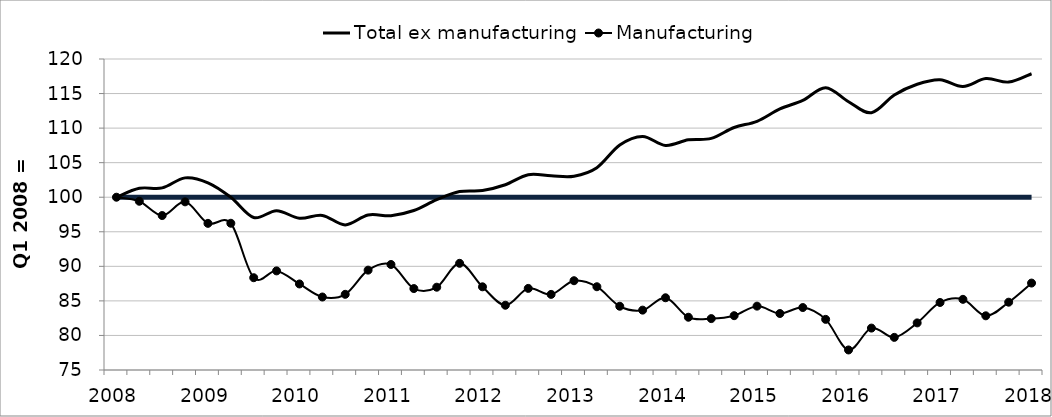
| Category | Base | Total ex manufacturing | Manufacturing |
|---|---|---|---|
| 2008.0 | 100 | 100 | 100 |
| nan | 100 | 101.29 | 99.417 |
| nan | 100 | 101.352 | 97.35 |
| nan | 100 | 102.8 | 99.331 |
| 2009.0 | 100 | 102.09 | 96.219 |
| nan | 100 | 99.99 | 96.233 |
| nan | 100 | 97.063 | 88.354 |
| nan | 100 | 98.056 | 89.341 |
| 2010.0 | 100 | 96.954 | 87.449 |
| nan | 100 | 97.37 | 85.562 |
| nan | 100 | 95.998 | 85.95 |
| nan | 100 | 97.429 | 89.451 |
| 2011.0 | 100 | 97.334 | 90.267 |
| nan | 100 | 98.078 | 86.783 |
| nan | 100 | 99.639 | 86.979 |
| nan | 100 | 100.816 | 90.436 |
| 2012.0 | 100 | 100.974 | 87.038 |
| nan | 100 | 101.803 | 84.37 |
| nan | 100 | 103.265 | 86.807 |
| nan | 100 | 103.107 | 85.941 |
| 2013.0 | 100 | 103.048 | 87.917 |
| nan | 100 | 104.278 | 87.047 |
| nan | 100 | 107.554 | 84.224 |
| nan | 100 | 108.794 | 83.661 |
| 2014.0 | 100 | 107.498 | 85.453 |
| nan | 100 | 108.301 | 82.633 |
| nan | 100 | 108.515 | 82.438 |
| nan | 100 | 110.09 | 82.859 |
| 2015.0 | 100 | 110.988 | 84.242 |
| nan | 100 | 112.774 | 83.173 |
| nan | 100 | 114.016 | 84.038 |
| nan | 100 | 115.848 | 82.326 |
| 2016.0 | 100 | 113.819 | 77.899 |
| nan | 100 | 112.23 | 81.064 |
| nan | 100 | 114.794 | 79.722 |
| nan | 100 | 116.345 | 81.815 |
| 2017.0 | 100 | 117.004 | 84.771 |
| nan | 100 | 116.014 | 85.225 |
| nan | 100 | 117.168 | 82.841 |
| nan | 100 | 116.663 | 84.811 |
| 2018.0 | 100 | 117.865 | 87.577 |